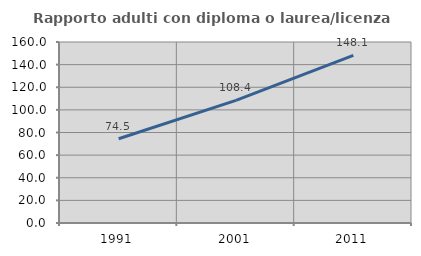
| Category | Rapporto adulti con diploma o laurea/licenza media  |
|---|---|
| 1991.0 | 74.453 |
| 2001.0 | 108.406 |
| 2011.0 | 148.142 |